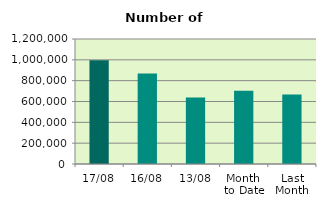
| Category | Series 0 |
|---|---|
| 17/08 | 995434 |
| 16/08 | 868714 |
| 13/08 | 639476 |
| Month 
to Date | 702269.333 |
| Last
Month | 667427.091 |